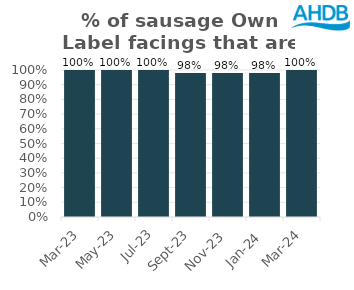
| Category | Sausage |
|---|---|
| 2023-03-01 | 1 |
| 2023-05-01 | 1 |
| 2023-07-01 | 1 |
| 2023-09-01 | 0.98 |
| 2023-11-01 | 0.98 |
| 2024-01-01 | 0.98 |
| 2024-03-01 | 1 |